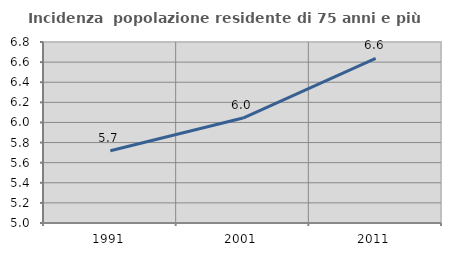
| Category | Incidenza  popolazione residente di 75 anni e più |
|---|---|
| 1991.0 | 5.718 |
| 2001.0 | 6.044 |
| 2011.0 | 6.637 |